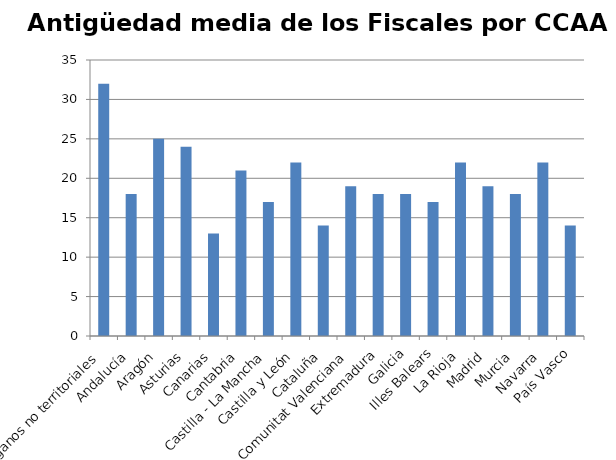
| Category | Series 0 |
|---|---|
| Órganos no territoriales | 32 |
| Andalucía | 18 |
| Aragón | 25 |
| Asturias | 24 |
| Canarias | 13 |
| Cantabria | 21 |
| Castilla - La Mancha | 17 |
| Castilla y León | 22 |
| Cataluña | 14 |
| Comunitat Valenciana | 19 |
| Extremadura | 18 |
| Galicia | 18 |
| Illes Balears | 17 |
| La Rioja | 22 |
| Madrid | 19 |
| Murcia | 18 |
| Navarra | 22 |
| País Vasco | 14 |